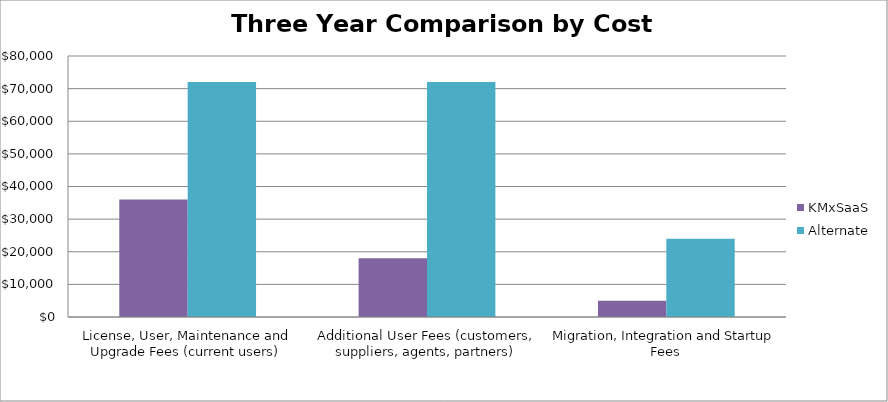
| Category | KMxSaaS | Alternate |
|---|---|---|
| License, User, Maintenance and Upgrade Fees (current users) | 36000 | 72000 |
| Additional User Fees (customers, suppliers, agents, partners) | 18000 | 72000 |
| Migration, Integration and Startup Fees | 5000 | 24000 |